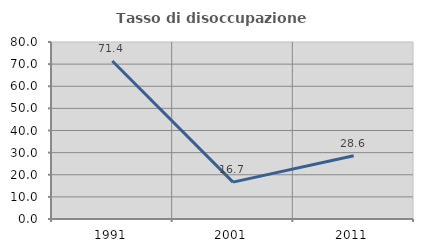
| Category | Tasso di disoccupazione giovanile  |
|---|---|
| 1991.0 | 71.429 |
| 2001.0 | 16.667 |
| 2011.0 | 28.571 |